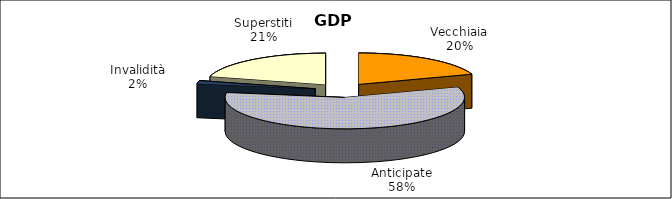
| Category | Series 0 |
|---|---|
| Vecchiaia | 29591 |
| Anticipate | 86754 |
| Invalidità | 2490 |
| Superstiti | 31218 |